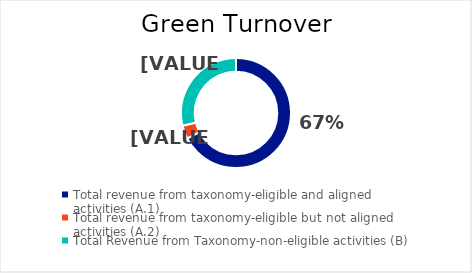
| Category | Series 0 |
|---|---|
| Total revenue from taxonomy-eligible and aligned activities (A.1) | 0.674 |
| Total revenue from taxonomy-eligible but not aligned activities (A.2) | 0.039 |
| Total Revenue from Taxonomy-non-eligible activities (B) | 0.287 |